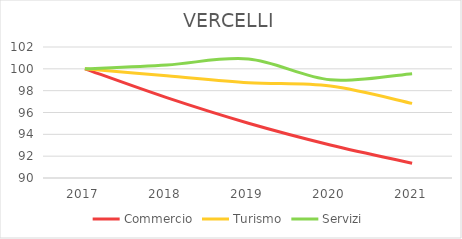
| Category | Commercio | Turismo | Servizi |
|---|---|---|---|
| 2017.0 | 100 | 100 | 100 |
| 2018.0 | 97.361 | 99.367 | 100.356 |
| 2019.0 | 95.019 | 98.734 | 100.901 |
| 2020.0 | 93.03 | 98.418 | 98.994 |
| 2021.0 | 91.357 | 96.835 | 99.56 |